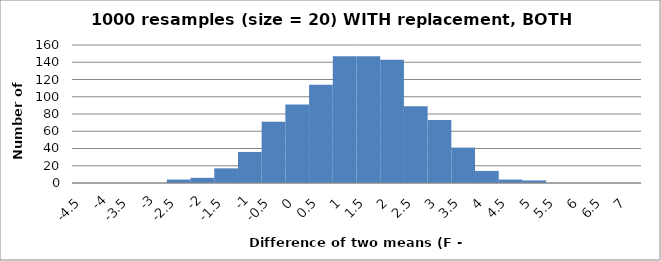
| Category | Number of resamples |
|---|---|
| -4.5 | 0 |
| -4.0 | 0 |
| -3.5 | 0 |
| -3.0 | 0 |
| -2.5 | 4 |
| -2.0 | 6 |
| -1.5 | 17 |
| -1.0 | 36 |
| -0.5 | 71 |
| 0.0 | 91 |
| 0.5 | 114 |
| 1.0 | 147 |
| 1.5 | 147 |
| 2.0 | 143 |
| 2.5 | 89 |
| 3.0 | 73 |
| 3.5 | 41 |
| 4.0 | 14 |
| 4.5 | 4 |
| 5.0 | 3 |
| 5.5 | 0 |
| 6.0 | 0 |
| 6.5 | 0 |
| 7.0 | 0 |